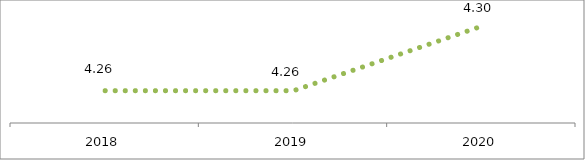
| Category | Engagement des employés |
|---|---|
| 2018.0 | 4.26 |
| 2019.0 | 4.26 |
| 2020.0 | 4.3 |